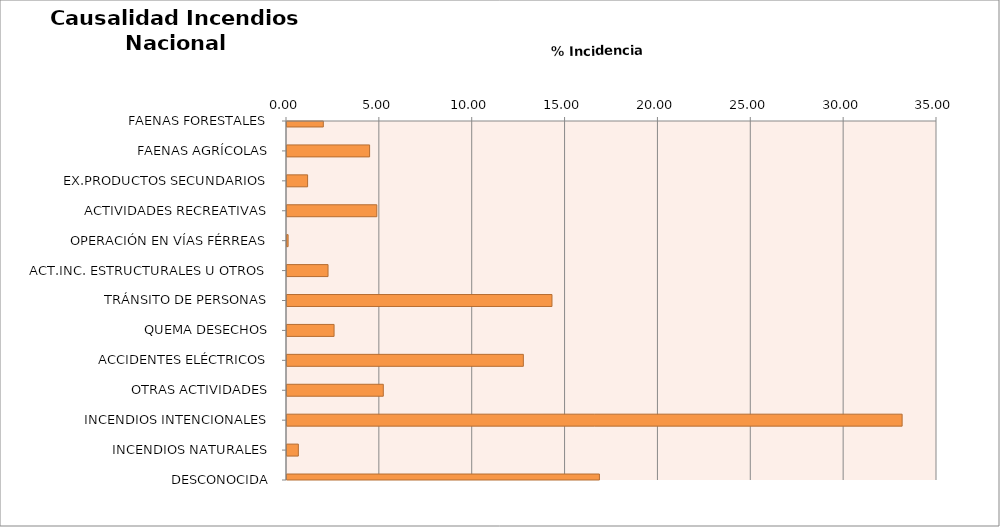
| Category | Series 0 |
|---|---|
| FAENAS FORESTALES | 1.956 |
| FAENAS AGRÍCOLAS | 4.448 |
| EX.PRODUCTOS SECUNDARIOS | 1.109 |
| ACTIVIDADES RECREATIVAS | 4.836 |
| OPERACIÓN EN VÍAS FÉRREAS | 0.059 |
| ACT.INC. ESTRUCTURALES U OTROS | 2.209 |
| TRÁNSITO DE PERSONAS | 14.268 |
| QUEMA DESECHOS | 2.534 |
| ACCIDENTES ELÉCTRICOS | 12.726 |
| OTRAS ACTIVIDADES | 5.186 |
| INCENDIOS INTENCIONALES | 33.122 |
| INCENDIOS NATURALES | 0.611 |
| DESCONOCIDA | 16.823 |